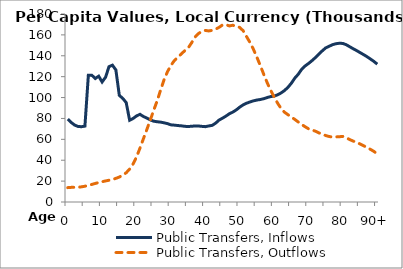
| Category | Public Transfers, Inflows | Public Transfers, Outflows |
|---|---|---|
| 0 | 79409.235 | 13747.133 |
|  | 76212.904 | 14007.825 |
| 2 | 73671.692 | 14050.746 |
| 3 | 72321.949 | 14137.774 |
| 4 | 72095.682 | 14511.389 |
| 5 | 72644.473 | 15076.532 |
| 6 | 121322.803 | 15897.24 |
| 7 | 121404.475 | 16834.572 |
| 8 | 118231.668 | 17756.645 |
| 9 | 120471.583 | 18592.398 |
| 10 | 114920.317 | 19416.023 |
| 11 | 119460.872 | 20171.305 |
| 12 | 129583.431 | 20823.151 |
| 13 | 131003.432 | 21622.258 |
| 14 | 126449.225 | 22618.799 |
| 15 | 102087.016 | 23896.447 |
| 16 | 99189.522 | 25717.774 |
| 17 | 95205.917 | 28023.542 |
| 18 | 78296.745 | 31474.829 |
| 19 | 79969.48 | 36415.353 |
| 20 | 82367.943 | 43095.314 |
| 21 | 83974.564 | 51503.673 |
| 22 | 81870.502 | 60506.656 |
| 23 | 80356.591 | 69355.264 |
| 24 | 78616.266 | 78470.101 |
| 25 | 77373.53 | 87780.687 |
| 26 | 76839.312 | 96895.318 |
| 27 | 76462.481 | 107107.037 |
| 28 | 75825.622 | 117005.334 |
| 29 | 75040.042 | 124713.353 |
| 30 | 73877.589 | 130737.209 |
| 31 | 73592.753 | 135437.449 |
| 32 | 73222.601 | 138529.187 |
| 33 | 72931.029 | 141757.536 |
| 34 | 72462.045 | 144738.552 |
| 35 | 72254.582 | 147484.827 |
| 36 | 72536.278 | 152292.816 |
| 37 | 72767.185 | 157890.515 |
| 38 | 72768.728 | 161225.92 |
| 39 | 72415.299 | 163406.653 |
| 40 | 72129.177 | 164270.705 |
| 41 | 72799.324 | 163782.634 |
| 42 | 73378.994 | 164328.415 |
| 43 | 75479.869 | 165550.315 |
| 44 | 78441.124 | 167218.752 |
| 45 | 80261.172 | 169489.142 |
| 46 | 82217.182 | 169753.388 |
| 47 | 84522.116 | 168561.993 |
| 48 | 86063.953 | 169230.493 |
| 49 | 88183.124 | 168268.167 |
| 50 | 90784.41 | 167135.048 |
| 51 | 93026.642 | 163997.628 |
| 52 | 94625.304 | 158301.248 |
| 53 | 95761.139 | 152702.556 |
| 54 | 96851.291 | 146121.206 |
| 55 | 97621.647 | 138659.709 |
| 56 | 98138.581 | 130507.652 |
| 57 | 98900.478 | 122234.186 |
| 58 | 100026.646 | 114169.762 |
| 59 | 100930.028 | 106988.967 |
| 60 | 101360.355 | 100658.507 |
| 61 | 102623.414 | 94754.732 |
| 62 | 104362.488 | 89653.63 |
| 63 | 106657.467 | 86045.682 |
| 64 | 109712.27 | 83649.584 |
| 65 | 113630.689 | 81468.5 |
| 66 | 118532.351 | 79095.659 |
| 67 | 122220.832 | 76659.753 |
| 68 | 126964.054 | 74275.661 |
| 69 | 130202.727 | 72095.283 |
| 70 | 132601.329 | 70102.294 |
| 71 | 135285.882 | 69027.805 |
| 72 | 138245.887 | 67804.555 |
| 73 | 141583.945 | 66222.236 |
| 74 | 144693.269 | 64895.121 |
| 75 | 147545.174 | 63643.726 |
| 76 | 149106.227 | 62694.674 |
| 77 | 150612.554 | 62223.08 |
| 78 | 151562.433 | 62324.447 |
| 79 | 151987.52 | 62531.408 |
| 80 | 151806.024 | 62754.507 |
| 81 | 150547.212 | 61449.721 |
| 82 | 148638.196 | 59757.305 |
| 83 | 146726.696 | 58299.27 |
| 84 | 144964.676 | 57084.971 |
| 85 | 143037.629 | 55531.934 |
| 86 | 141136.624 | 53933.623 |
| 87 | 139141.938 | 52240.533 |
| 88 | 136910.947 | 50418.909 |
| 89 | 134645.885 | 48455.073 |
| 90+ | 131958.998 | 46094.797 |